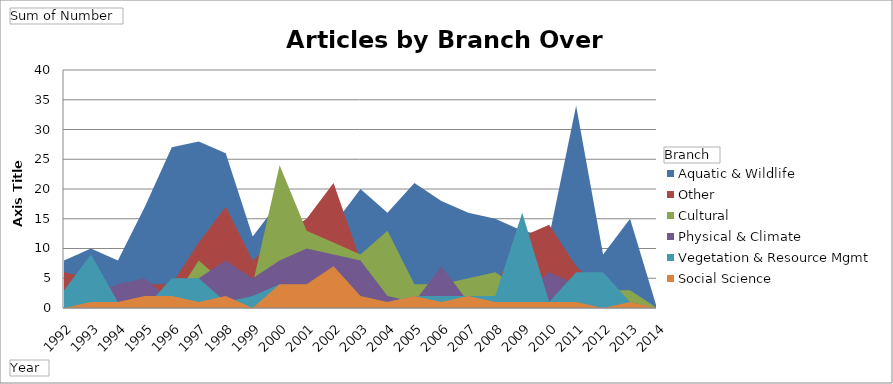
| Category | Aquatic & Wildlife | Other | Cultural | Physical & Climate | Vegetation & Resource Mgmt | Social Science |
|---|---|---|---|---|---|---|
| 1992 | 8 | 6 | 1 | 3 | 3 | 0 |
| 1993 | 10 | 5 | 3 | 2 | 9 | 1 |
| 1994 | 8 | 3 | 0 | 4 | 1 | 1 |
| 1995 | 17 | 4 | 2 | 5 | 0 | 2 |
| 1996 | 27 | 4 | 1 | 1 | 5 | 2 |
| 1997 | 28 | 11 | 8 | 5 | 5 | 1 |
| 1998 | 26 | 17 | 4 | 8 | 1 | 2 |
| 1999 | 12 | 8 | 4 | 5 | 2 | 0 |
| 2000 | 18 | 12 | 24 | 8 | 4 | 4 |
| 2001 | 13 | 15 | 13 | 10 | 3 | 4 |
| 2002 | 14 | 21 | 11 | 9 | 1 | 7 |
| 2003 | 20 | 8 | 9 | 8 | 1 | 2 |
| 2004 | 16 | 8 | 13 | 2 | 1 | 1 |
| 2005 | 21 | 3 | 4 | 1 | 2 | 2 |
| 2006 | 18 | 1 | 4 | 7 | 2 | 1 |
| 2007 | 16 | 4 | 5 | 1 | 2 | 2 |
| 2008 | 15 | 4 | 6 | 0 | 2 | 1 |
| 2009 | 13 | 12 | 3 | 2 | 16 | 1 |
| 2010 | 12 | 14 | 5 | 6 | 1 | 1 |
| 2011 | 34 | 7 | 2 | 4 | 6 | 1 |
| 2012 | 9 | 3 | 3 | 5 | 6 | 0 |
| 2013 | 15 | 2 | 3 | 0 | 1 | 1 |
| 2014 | 0 | 0 | 0 | 0 | 0 | 0 |